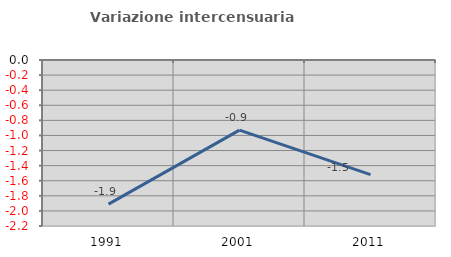
| Category | Variazione intercensuaria annua |
|---|---|
| 1991.0 | -1.91 |
| 2001.0 | -0.929 |
| 2011.0 | -1.519 |